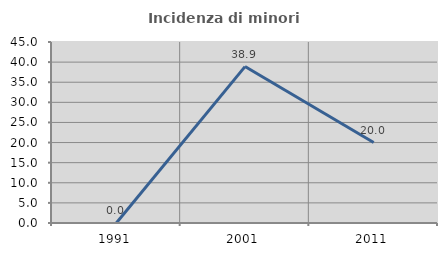
| Category | Incidenza di minori stranieri |
|---|---|
| 1991.0 | 0 |
| 2001.0 | 38.889 |
| 2011.0 | 20 |